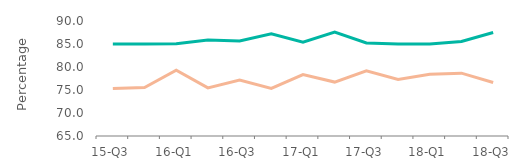
| Category | First-time
buyers | Home movers |
|---|---|---|
| 15-Q3 | 85 | 75.305 |
| 15-Q4 | 85 | 75.54 |
| 16-Q1 | 85.04 | 79.29 |
| 16-Q2 | 85.85 | 75.46 |
| 16-Q3 | 85.64 | 77.17 |
| 16-Q4 | 87.21 | 75.36 |
| 17-Q1 | 85.385 | 78.345 |
| 17-Q2 | 87.595 | 76.725 |
| 17-Q3 | 85.21 | 79.17 |
| 17-Q4 | 85 | 77.295 |
| 18-Q1 | 85 | 78.405 |
| 18-Q2 | 85.54 | 78.66 |
| 18-Q3 | 87.5 | 76.62 |